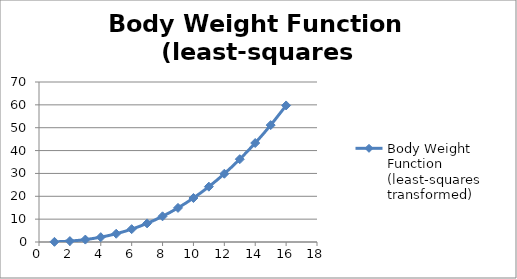
| Category | Body Weight Function (least-squares transformed) |
|---|---|
| 1.0 | 0.075 |
| 2.0 | 0.398 |
| 3.0 | 1.057 |
| 4.0 | 2.115 |
| 5.0 | 3.621 |
| 6.0 | 5.619 |
| 7.0 | 8.147 |
| 8.0 | 11.24 |
| 9.0 | 14.929 |
| 10.0 | 19.245 |
| 11.0 | 24.215 |
| 12.0 | 29.865 |
| 13.0 | 36.219 |
| 14.0 | 43.302 |
| 15.0 | 51.136 |
| 16.0 | 59.742 |